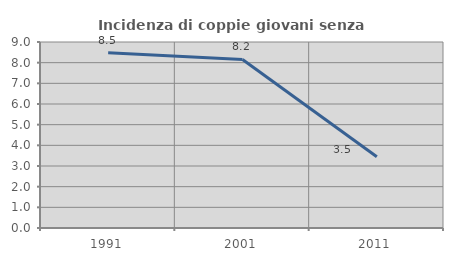
| Category | Incidenza di coppie giovani senza figli |
|---|---|
| 1991.0 | 8.479 |
| 2001.0 | 8.156 |
| 2011.0 | 3.45 |